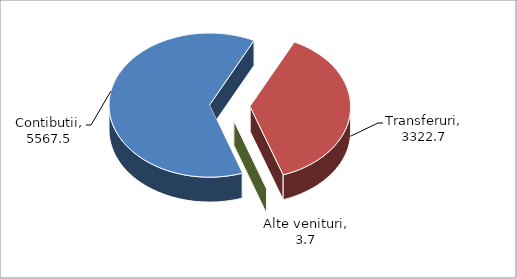
| Category | Series 0 |
|---|---|
| Contibutii | 5567.5 |
| Transferuri | 3322.7 |
| Alte venituri | 3.7 |